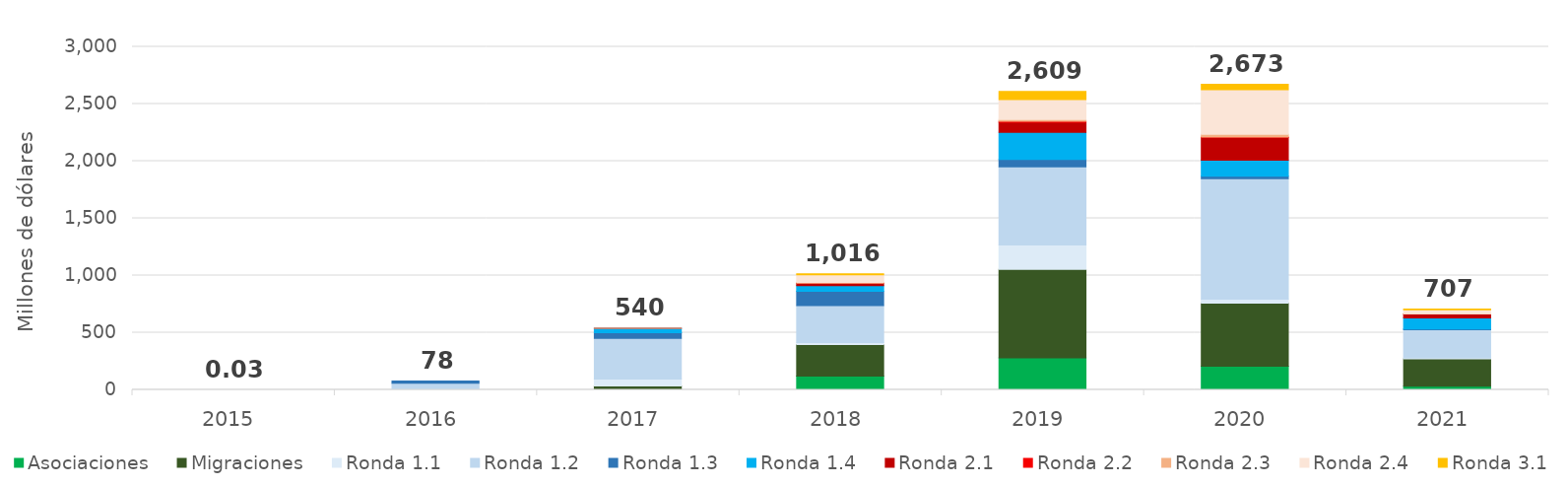
| Category | Asociaciones | Migraciones | Ronda 1.1 | Ronda 1.2 | Ronda 1.3 | Ronda 1.4 | Ronda 2.1 | Ronda 2.2 | Ronda 2.3 | Ronda 2.4 | Ronda 3.1 |
|---|---|---|---|---|---|---|---|---|---|---|---|
| 2015.0 | 0 | 0 | 0.023 | 0.003 | 0 | 0 | 0 | 0 | 0 | 0 | 0 |
| 2016.0 | 0 | 0 | 7.936 | 50.902 | 19.085 | 0 | 0 | 0 | 0 | 0 | 0 |
| 2017.0 | 1.551 | 32.93 | 60.276 | 356.292 | 49.062 | 38.707 | 0.93 | 0 | 0.096 | 0 | 0 |
| 2018.0 | 121.371 | 276.221 | 16.154 | 323.201 | 126.084 | 47.616 | 21.584 | 0.843 | 6.737 | 66.299 | 9.669 |
| 2019.0 | 280.617 | 772.208 | 213.486 | 685.106 | 64.244 | 235.595 | 88.72 | 9.392 | 14.554 | 175.703 | 69.349 |
| 2020.0 | 207.708 | 550.53 | 33.998 | 1054.149 | 22.253 | 140.295 | 198.226 | 3.04 | 23.879 | 391.695 | 46.857 |
| 2021.0 | 33.33 | 239.188 | 6.899 | 247.518 | 5.66 | 96.434 | 35.42 | 0.044 | 2.139 | 34.828 | 5.807 |